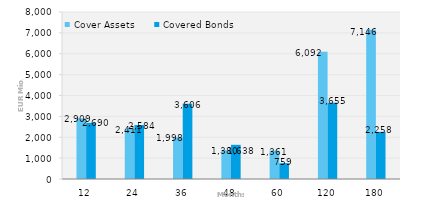
| Category | Cover Assets | Covered Bonds |
|---|---|---|
| 12.0 | 2908.667 | 2690.183 |
| 24.0 | 2410.947 | 2583.981 |
| 36.0 | 1997.751 | 3605.685 |
| 48.0 | 1380.121 | 1637.824 |
| 60.0 | 1360.513 | 758.78 |
| 120.0 | 6091.834 | 3654.708 |
| 180.0 | 7146.459 | 2258.209 |